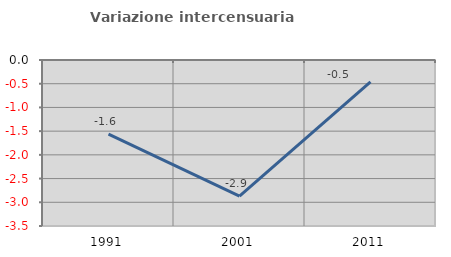
| Category | Variazione intercensuaria annua |
|---|---|
| 1991.0 | -1.562 |
| 2001.0 | -2.871 |
| 2011.0 | -0.462 |